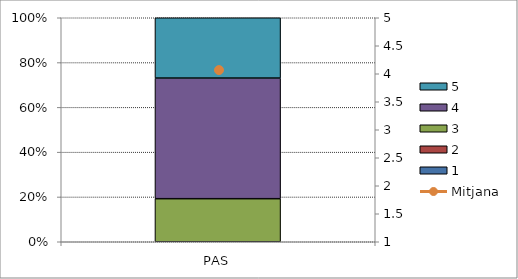
| Category | 1 | 2 | 3 | 4 | 5 |
|---|---|---|---|---|---|
| PAS | 0 | 0 | 5 | 14 | 7 |